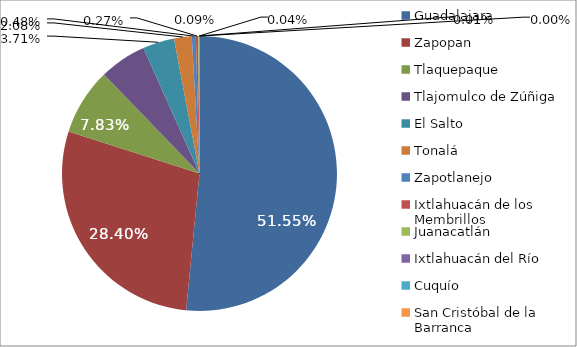
| Category | Series 0 |
|---|---|
| Guadalajara | 700796 |
| Zapopan | 386055 |
| Tlaquepaque | 106403 |
| Tlajomulco de Zúñiga | 75248 |
| El Salto | 50376 |
| Tonalá | 28243 |
| Zapotlanejo | 6556 |
| Ixtlahuacán de los Membrillos | 3693 |
| Juanacatlán | 1184 |
| Ixtlahuacán del Río | 589 |
| Cuquío | 179 |
| San Cristóbal de la Barranca | 18 |